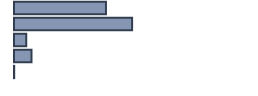
| Category | Percentatge |
|---|---|
| 0 | 38.317 |
| 1 | 49.212 |
| 2 | 5.103 |
| 3 | 7.289 |
| 4 | 0.079 |